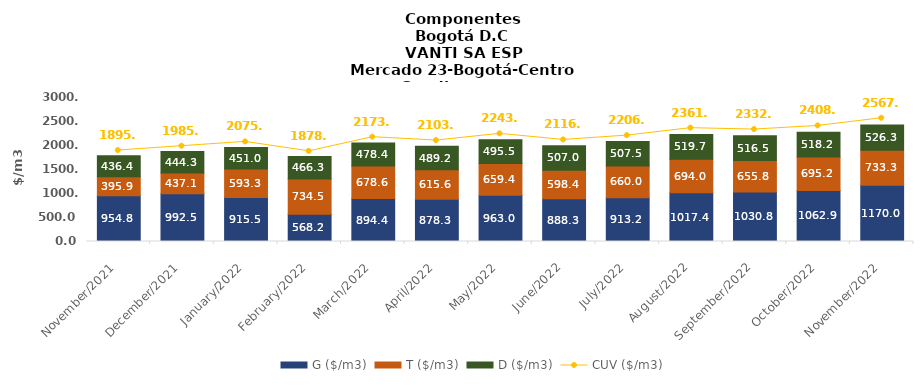
| Category | G ($/m3) | T ($/m3) | D ($/m3) |
|---|---|---|---|
| 2021-11-01 | 954.84 | 395.94 | 436.4 |
| 2021-12-01 | 992.5 | 437.11 | 444.32 |
| 2022-01-01 | 915.46 | 593.32 | 451.03 |
| 2022-02-01 | 568.19 | 734.47 | 466.27 |
| 2022-03-01 | 894.37 | 678.63 | 478.39 |
| 2022-04-01 | 878.25 | 615.62 | 489.18 |
| 2022-05-01 | 963.04 | 659.37 | 495.47 |
| 2022-06-01 | 888.33 | 598.42 | 506.96 |
| 2022-07-01 | 913.23 | 660.02 | 507.54 |
| 2022-08-01 | 1017.43 | 694.03 | 519.71 |
| 2022-09-01 | 1030.83 | 655.81 | 516.52 |
| 2022-10-01 | 1062.85 | 695.15 | 518.18 |
| 2022-11-01 | 1169.95 | 733.29 | 526.27 |